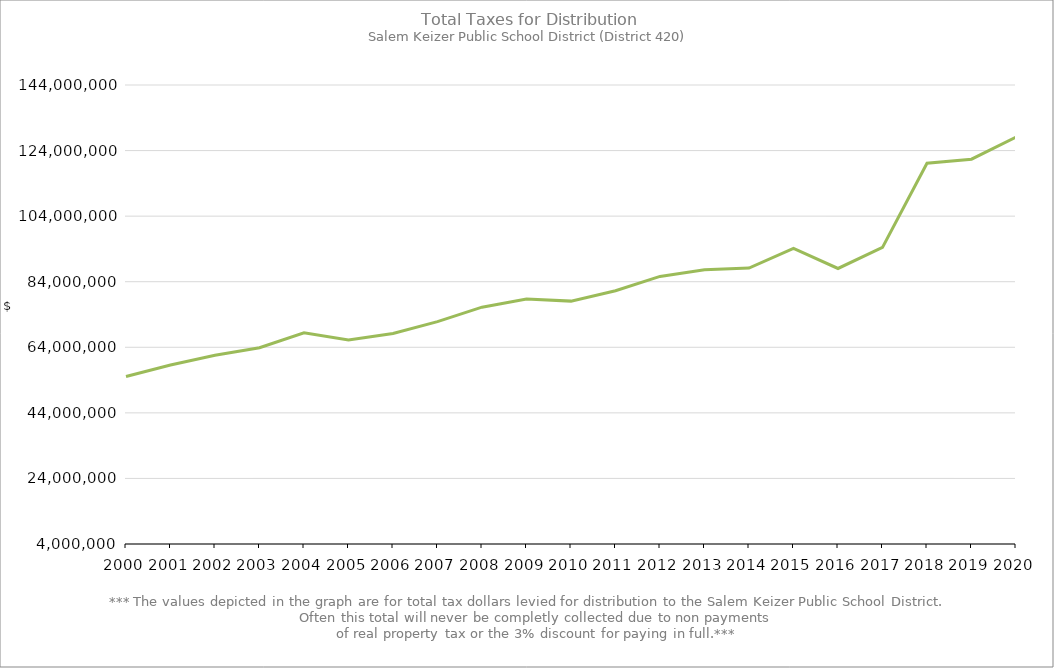
| Category | Series 0 |
|---|---|
| 2000.0 | 55105930.99 |
| 2001.0 | 58579304.1 |
| 2002.0 | 61566360.55 |
| 2003.0 | 63849559.82 |
| 2004.0 | 68439160.34 |
| 2005.0 | 66210809.32 |
| 2006.0 | 68226597.41 |
| 2007.0 | 71822987.45 |
| 2008.0 | 76235178.29 |
| 2009.0 | 78693582.23 |
| 2010.0 | 78081782.69 |
| 2011.0 | 81241707.52 |
| 2012.0 | 85616615.36 |
| 2013.0 | 87625263.77 |
| 2014.0 | 88153040.94 |
| 2015.0 | 94147409.72 |
| 2016.0 | 88037379.32 |
| 2017.0 | 94448887.75 |
| 2018.0 | 120125678.42 |
| 2019.0 | 121368278.74 |
| 2020.0 | 128106403.98 |